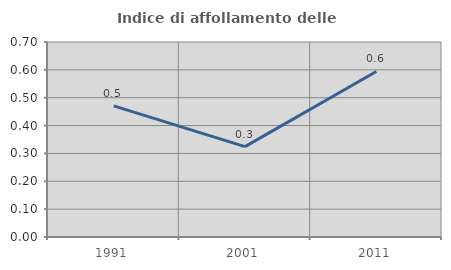
| Category | Indice di affollamento delle abitazioni  |
|---|---|
| 1991.0 | 0.471 |
| 2001.0 | 0.324 |
| 2011.0 | 0.594 |